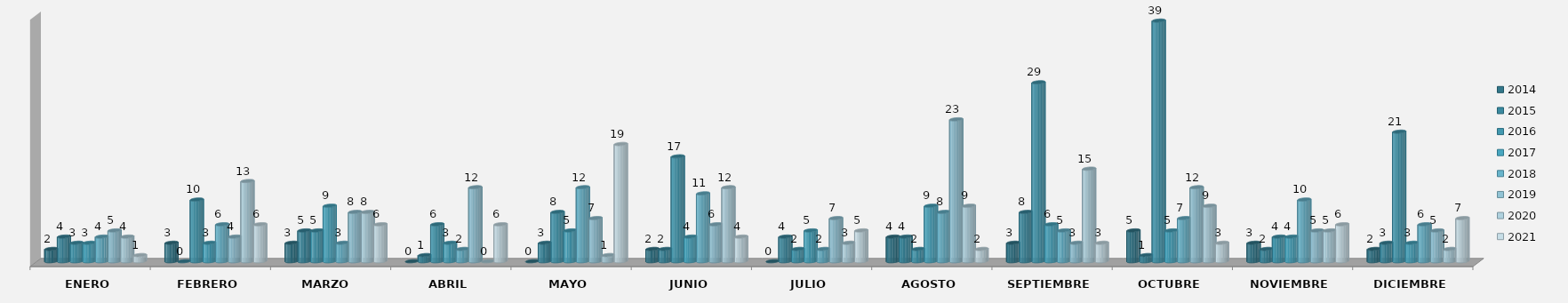
| Category | 2014 | 2015 | 2016 | 2017 | 2018 | 2019 | 2020 | 2021 |
|---|---|---|---|---|---|---|---|---|
| ENERO | 2 | 4 | 3 | 3 | 4 | 5 | 4 | 1 |
| FEBRERO | 3 | 0 | 10 | 3 | 6 | 4 | 13 | 6 |
| MARZO  | 3 | 5 | 5 | 9 | 3 | 8 | 8 | 6 |
| ABRIL | 0 | 1 | 6 | 3 | 2 | 12 | 0 | 6 |
| MAYO | 0 | 3 | 8 | 5 | 12 | 7 | 1 | 19 |
| JUNIO | 2 | 2 | 17 | 4 | 11 | 6 | 12 | 4 |
| JULIO | 0 | 4 | 2 | 5 | 2 | 7 | 3 | 5 |
| AGOSTO | 4 | 4 | 2 | 9 | 8 | 23 | 9 | 2 |
| SEPTIEMBRE | 3 | 8 | 29 | 6 | 5 | 3 | 15 | 3 |
| OCTUBRE | 5 | 1 | 39 | 5 | 7 | 12 | 9 | 3 |
| NOVIEMBRE | 3 | 2 | 4 | 4 | 10 | 5 | 5 | 6 |
| DICIEMBRE | 2 | 3 | 21 | 3 | 6 | 5 | 2 | 7 |